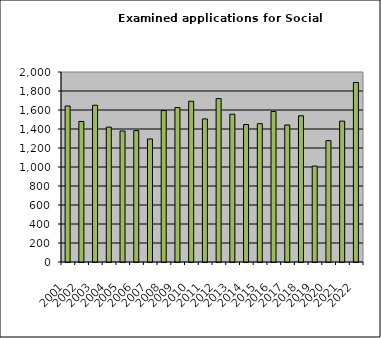
| Category | Series 1 |
|---|---|
| 2001.0 | 1642 |
| 2002.0 | 1479 |
| 2003.0 | 1650 |
| 2004.0 | 1420 |
| 2005.0 | 1379 |
| 2006.0 | 1383 |
| 2007.0 | 1295 |
| 2008.0 | 1594 |
| 2009.0 | 1626 |
| 2010.0 | 1692 |
| 2011.0 | 1506 |
| 2012.0 | 1720 |
| 2013.0 | 1556 |
| 2014.0 | 1447 |
| 2015.0 | 1456 |
| 2016.0 | 1585 |
| 2017.0 | 1442 |
| 2018.0 | 1539 |
| 2019.0 | 1010 |
| 2020.0 | 1278 |
| 2021.0 | 1483 |
| 2022.0 | 1890 |